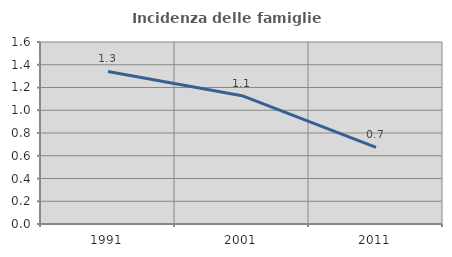
| Category | Incidenza delle famiglie numerose |
|---|---|
| 1991.0 | 1.341 |
| 2001.0 | 1.128 |
| 2011.0 | 0.674 |